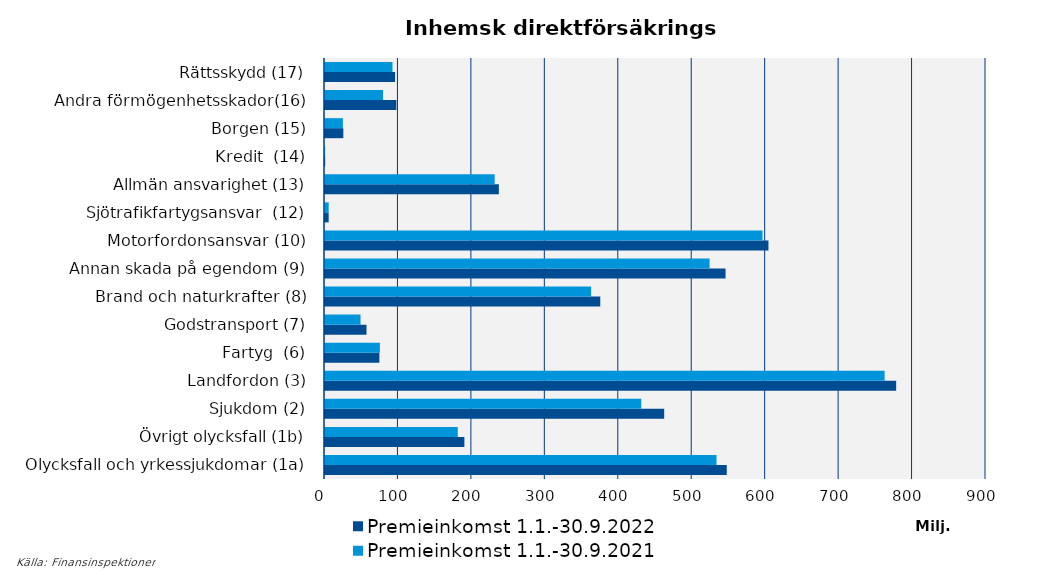
| Category | Premieinkomst |
|---|---|
| Olycksfall och yrkessjukdomar (1a) | 533080.547 |
| Övrigt olycksfall (1b) | 180782.275 |
| Sjukdom (2) | 430573.208 |
| Landfordon (3) | 761963.445 |
| Fartyg  (6) | 74783.445 |
| Godstransport (7) | 48396.317 |
| Brand och naturkrafter (8) | 362357.53 |
| Annan skada på egendom (9) | 523647.256 |
| Motorfordonsansvar (10) | 595709.309 |
| Sjötrafikfartygsansvar  (12) | 5033.968 |
| Allmän ansvarighet (13) | 231048.151 |
| Kredit  (14) | 204.189 |
| Borgen (15) | 24357.257 |
| Andra förmögenhetsskador(16) | 78995.253 |
| Rättsskydd (17) | 91908.641 |